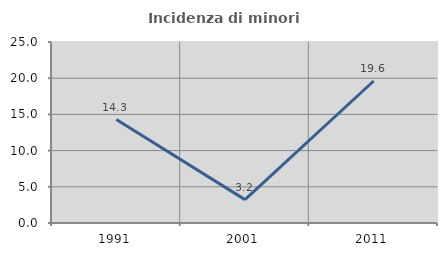
| Category | Incidenza di minori stranieri |
|---|---|
| 1991.0 | 14.286 |
| 2001.0 | 3.226 |
| 2011.0 | 19.614 |